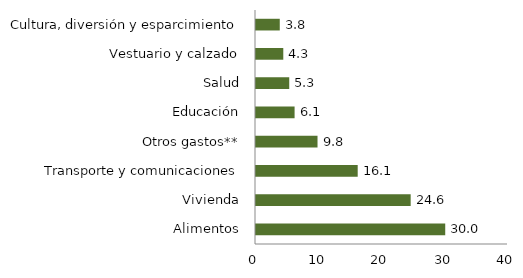
| Category | Series 0 |
|---|---|
| Alimentos | 30.037 |
| Vivienda | 24.55 |
| Transporte y comunicaciones | 16.143 |
| Otros gastos** | 9.765 |
| Educación | 6.125 |
| Salud | 5.276 |
| Vestuario y calzado | 4.332 |
| Cultura, diversión y esparcimiento | 3.772 |